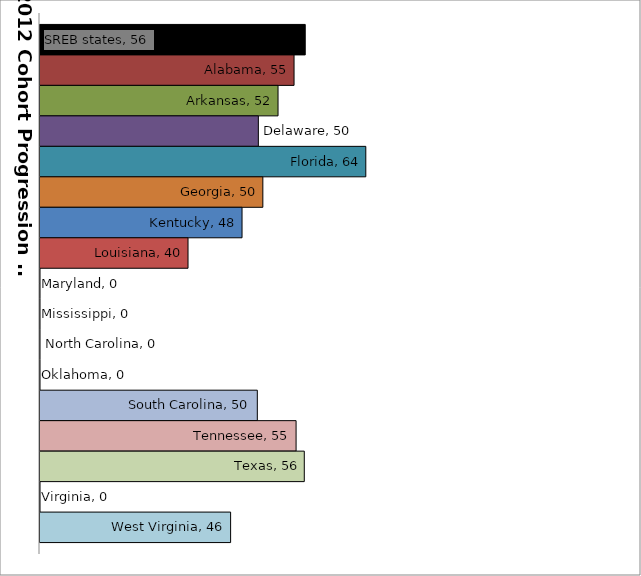
| Category | SREB states | Alabama | Arkansas | Delaware | Florida | Georgia | Kentucky | Louisiana | Maryland | Mississippi | North Carolina | Oklahoma | South Carolina | Tennessee | Texas | Virginia | West Virginia |
|---|---|---|---|---|---|---|---|---|---|---|---|---|---|---|---|---|---|
| 0 | 56.21 | 54.682 | 52.496 | 49.809 | 64.479 | 50.424 | 47.581 | 40.208 | 0 | 0 | 0 | 0 | 49.669 | 54.96 | 56.081 | 0 | 46.023 |